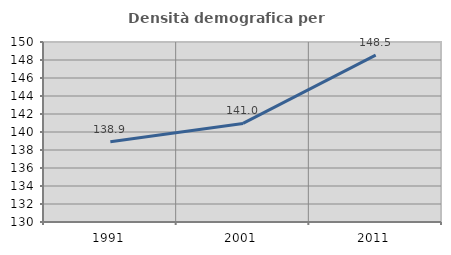
| Category | Densità demografica |
|---|---|
| 1991.0 | 138.919 |
| 2001.0 | 140.956 |
| 2011.0 | 148.534 |